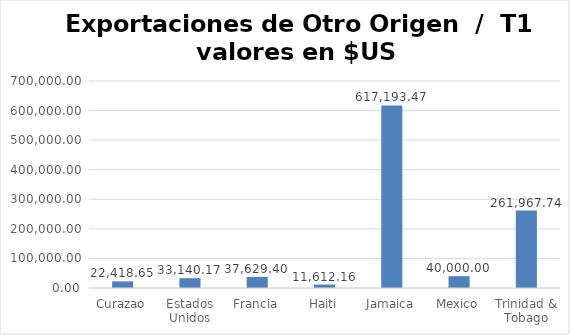
| Category | Valor US  |
|---|---|
| Curazao | 22418.65 |
| Estados Unidos | 33140.17 |
| Francia | 37629.398 |
| Haiti | 11612.16 |
| Jamaica | 617193.471 |
| Mexico | 40000 |
| Trinidad & Tobago | 261967.739 |